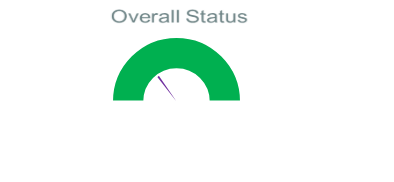
| Category | Pointer |
|---|---|
| 0 | 29.167 |
| 1 | 2 |
| 2 | 170.833 |